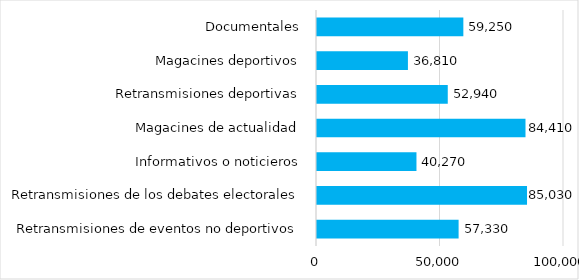
| Category | Audiencia en diferido |
|---|---|
| Retransmisiones de eventos no deportivos | 57330 |
| Retransmisiones de los debates electorales | 85030 |
| Informativos o noticieros | 40270 |
| Magacines de actualidad | 84410 |
| Retransmisiones deportivas | 52940 |
| Magacines deportivos | 36810 |
| Documentales | 59250 |